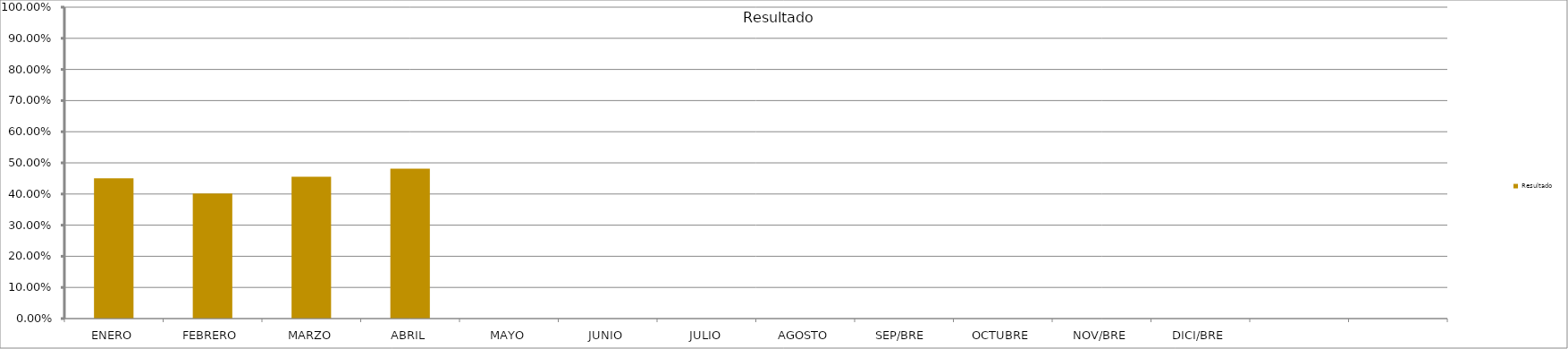
| Category | Resultado  |
|---|---|
| ENERO | 0.45 |
| FEBRERO | 0.401 |
| MARZO | 0.455 |
| ABRIL | 0.481 |
| MAYO | 0 |
| JUNIO | 0 |
| JULIO | 0 |
| AGOSTO | 0 |
| SEP/BRE  | 0 |
| OCTUBRE | 0 |
| NOV/BRE | 0 |
| DICI/BRE | 0 |